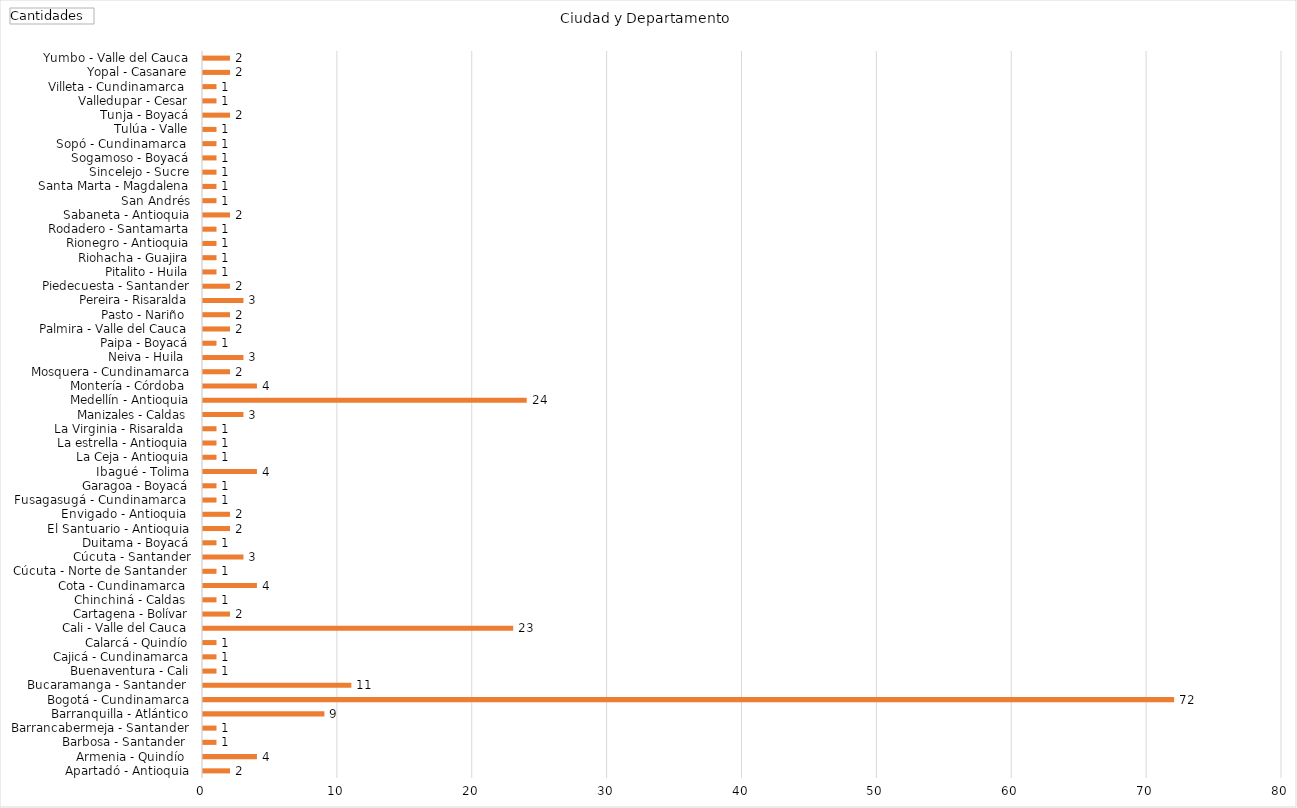
| Category | Total |
|---|---|
| Apartadó - Antioquia | 2 |
| Armenia - Quindío  | 4 |
| Barbosa - Santander  | 1 |
| Barrancabermeja - Santander | 1 |
| Barranquilla - Atlántico | 9 |
| Bogotá - Cundinamarca | 72 |
| Bucaramanga - Santander  | 11 |
| Buenaventura - Cali | 1 |
| Cajicá - Cundinamarca | 1 |
| Calarcá - Quindío | 1 |
| Cali - Valle del Cauca | 23 |
| Cartagena - Bolívar | 2 |
| Chinchiná - Caldas  | 1 |
| Cota - Cundinamarca  | 4 |
| Cúcuta - Norte de Santander  | 1 |
| Cúcuta - Santander | 3 |
| Duitama - Boyacá | 1 |
| El Santuario - Antioquia | 2 |
| Envigado - Antioquia  | 2 |
| Fusagasugá - Cundinamarca  | 1 |
| Garagoa - Boyacá | 1 |
| Ibagué - Tolima | 4 |
| La Ceja - Antioquia | 1 |
| La estrella - Antioquia | 1 |
| La Virginia - Risaralda  | 1 |
| Manizales - Caldas | 3 |
| Medellín - Antioquia | 24 |
| Montería - Córdoba  | 4 |
| Mosquera - Cundinamarca | 2 |
| Neiva - Huila  | 3 |
| Paipa - Boyacá | 1 |
| Palmira - Valle del Cauca | 2 |
| Pasto - Nariño  | 2 |
| Pereira - Risaralda | 3 |
| Piedecuesta - Santander | 2 |
| Pitalito - Huila | 1 |
| Riohacha - Guajira | 1 |
| Rionegro - Antioquia | 1 |
| Rodadero - Santamarta | 1 |
| Sabaneta - Antioquia | 2 |
| San Andrés | 1 |
| Santa Marta - Magdalena | 1 |
| Sincelejo - Sucre | 1 |
| Sogamoso - Boyacá | 1 |
| Sopó - Cundinamarca  | 1 |
| Tulúa - Valle | 1 |
| Tunja - Boyacá | 2 |
| Valledupar - Cesar | 1 |
| Villeta - Cundinamarca  | 1 |
| Yopal - Casanare | 2 |
| Yumbo - Valle del Cauca | 2 |